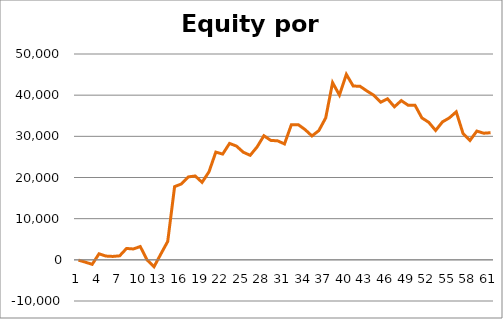
| Category | Series 0 |
|---|---|
| 0 | -68.7 |
| 1 | -558.7 |
| 2 | -1096.2 |
| 3 | 1473.8 |
| 4 | 913.8 |
| 5 | 826.3 |
| 6 | 971.3 |
| 7 | 2761.3 |
| 8 | 2641.3 |
| 9 | 3228.8 |
| 10 | -41.2 |
| 11 | -1691.2 |
| 12 | 1418.8 |
| 13 | 4478.8 |
| 14 | 17778.8 |
| 15 | 18441.3 |
| 16 | 20141.3 |
| 17 | 20371.3 |
| 18 | 18831.3 |
| 19 | 21356.3 |
| 20 | 26166.3 |
| 21 | 25691.3 |
| 22 | 28278.8 |
| 23 | 27635.05 |
| 24 | 26145.05 |
| 25 | 25388.85 |
| 26 | 27401.35 |
| 27 | 30146.35 |
| 28 | 29015.15 |
| 29 | 28905.15 |
| 30 | 28155.15 |
| 31 | 32830.15 |
| 32 | 32842.65 |
| 33 | 31630.15 |
| 34 | 30092.65 |
| 35 | 31392.65 |
| 36 | 34486.4 |
| 37 | 43046.4 |
| 38 | 40021.4 |
| 39 | 45061.4 |
| 40 | 42223.9 |
| 41 | 42155.15 |
| 42 | 41015.15 |
| 43 | 39975.15 |
| 44 | 38293.9 |
| 45 | 39113.9 |
| 46 | 37173.9 |
| 47 | 38680.15 |
| 48 | 37550.15 |
| 49 | 37550.15 |
| 50 | 34480.15 |
| 51 | 33405.15 |
| 52 | 31430.15 |
| 53 | 33517.65 |
| 54 | 34477.65 |
| 55 | 35952.65 |
| 56 | 30652.65 |
| 57 | 28990.15 |
| 58 | 31277.65 |
| 59 | 30757.65 |
| 60 | 30877.65 |